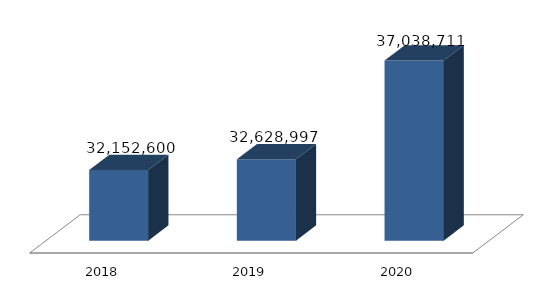
| Category | Dukungan Manajemen dan Pelaksanaan Tugas Teknis Lainnya Wantanas |
|---|---|
| 2018.0 | 32152600 |
| 2019.0 | 32628997 |
| 2020.0 | 37038711 |